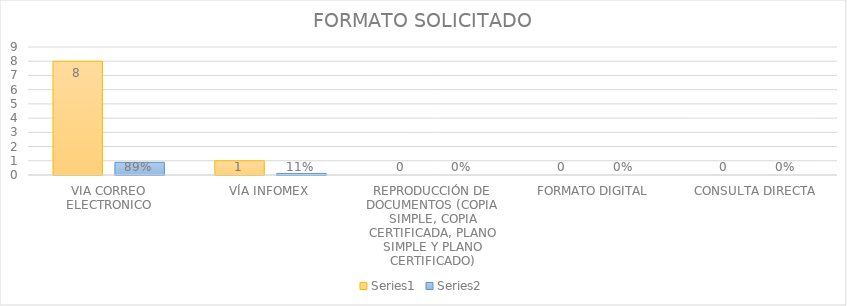
| Category | Series 3 | Series 4 |
|---|---|---|
| VIA CORREO ELECTRONICO | 8 | 0.89 |
| VÍA INFOMEX | 1 | 0.11 |
| REPRODUCCIÓN DE DOCUMENTOS (COPIA SIMPLE, COPIA CERTIFICADA, PLANO SIMPLE Y PLANO CERTIFICADO) | 0 | 0 |
| FORMATO DIGITAL | 0 | 0 |
| CONSULTA DIRECTA | 0 | 0 |